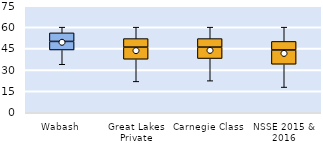
| Category | 25th | 50th | 75th |
|---|---|---|---|
| Wabash | 44 | 6 | 6 |
| Great Lakes Private | 37.5 | 8.5 | 6 |
| Carnegie Class | 38 | 8 | 6 |
| NSSE 2015 & 2016 | 34 | 10 | 6 |